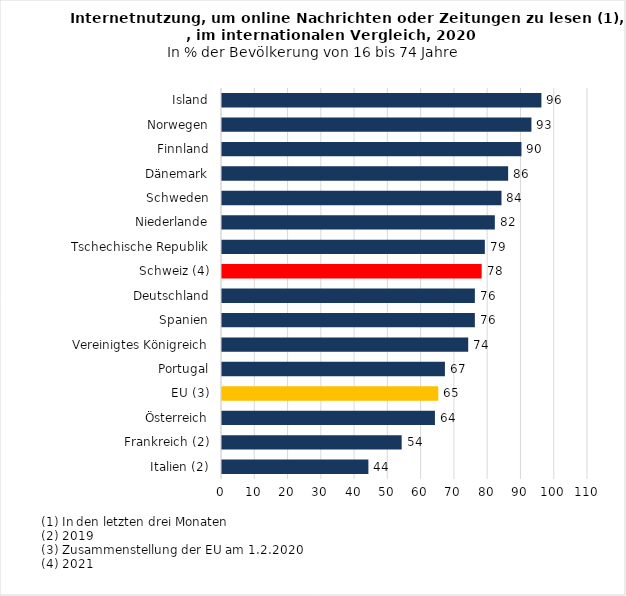
| Category | Series 0 |
|---|---|
| Italien (2) | 44 |
| Frankreich (2) | 54 |
| Österreich | 64 |
| EU (3) | 65 |
| Portugal | 67 |
| Vereinigtes Königreich | 74 |
| Spanien | 76 |
| Deutschland | 76 |
| Schweiz (4) | 78.042 |
| Tschechische Republik | 79 |
| Niederlande | 82 |
| Schweden | 84 |
| Dänemark | 86 |
| Finnland | 90 |
| Norwegen | 93 |
| Island | 96 |